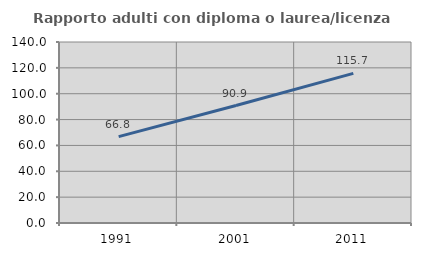
| Category | Rapporto adulti con diploma o laurea/licenza media  |
|---|---|
| 1991.0 | 66.812 |
| 2001.0 | 90.855 |
| 2011.0 | 115.733 |